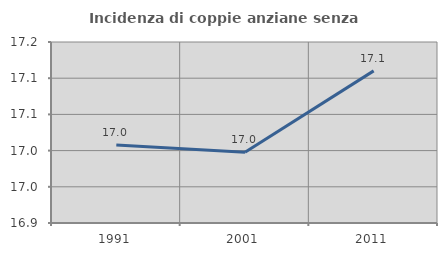
| Category | Incidenza di coppie anziane senza figli  |
|---|---|
| 1991.0 | 17.008 |
| 2001.0 | 16.998 |
| 2011.0 | 17.11 |